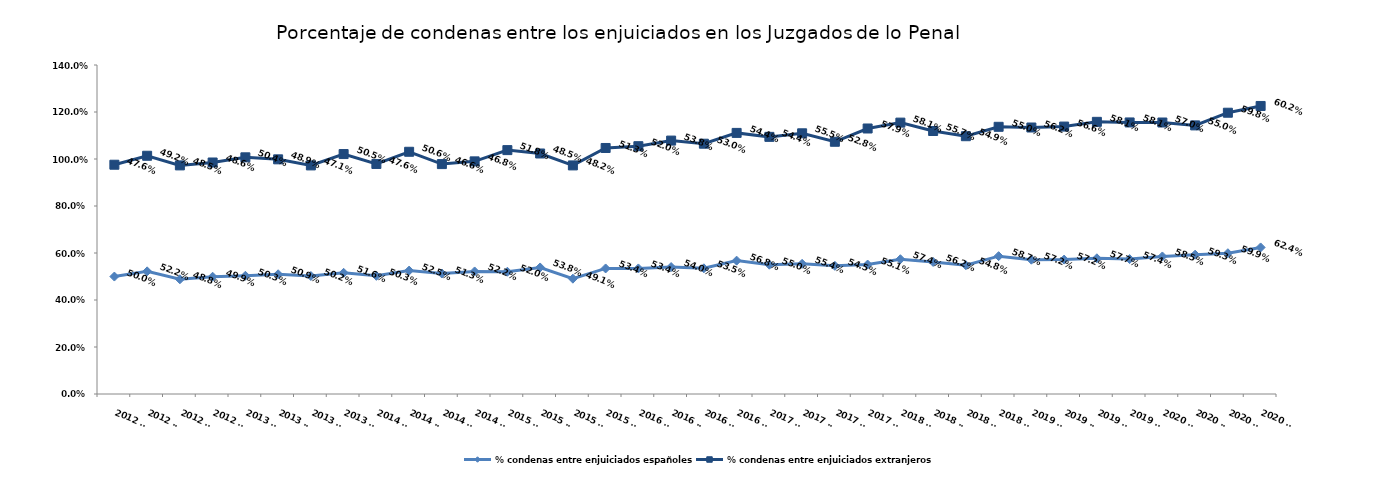
| Category | % condenas entre enjuiciados españoles | % condenas entre enjuiciados extranjeros |
|---|---|---|
| 2012 T1 | 0.5 | 0.476 |
| 2012 T2 | 0.522 | 0.492 |
| 2012 T3 | 0.488 | 0.485 |
| 2012 T4 | 0.499 | 0.486 |
| 2013 T1 | 0.503 | 0.504 |
| 2013 T2 | 0.509 | 0.489 |
| 2013 T3 | 0.502 | 0.471 |
| 2013 T4 | 0.516 | 0.505 |
| 2014 T1 | 0.503 | 0.476 |
| 2014 T2 | 0.525 | 0.506 |
| 2014 T3 | 0.513 | 0.466 |
| 2014 T4 | 0.522 | 0.468 |
| 2015 T1 | 0.52 | 0.518 |
| 2015 T2 | 0.538 | 0.485 |
| 2015 T3 | 0.491 | 0.482 |
| 2015 T4 | 0.534 | 0.513 |
| 2016 T1 | 0.534 | 0.52 |
| 2016 T2 | 0.54 | 0.538 |
| 2016 T3 | 0.535 | 0.53 |
| 2016 T4 | 0.568 | 0.544 |
| 2017 T1 | 0.55 | 0.544 |
| 2017 T2 | 0.554 | 0.555 |
| 2017 T3 | 0.545 | 0.528 |
| 2017 T4 | 0.551 | 0.579 |
| 2018 T1 | 0.574 | 0.581 |
| 2018 T2 | 0.562 | 0.557 |
| 2018 T3 | 0.548 | 0.549 |
| 2018 T4 | 0.587 | 0.55 |
| 2019 T1 | 0.572 | 0.562 |
| 2019 T2 | 0.572 | 0.566 |
| 2019 T3 | 0.577 | 0.581 |
| 2019 T4 | 0.574 | 0.581 |
| 2020 T1 | 0.585 | 0.57 |
| 2020 T2 | 0.593 | 0.55 |
| 2020 T3 | 0.599 | 0.598 |
| 2020 T4 | 0.624 | 0.602 |